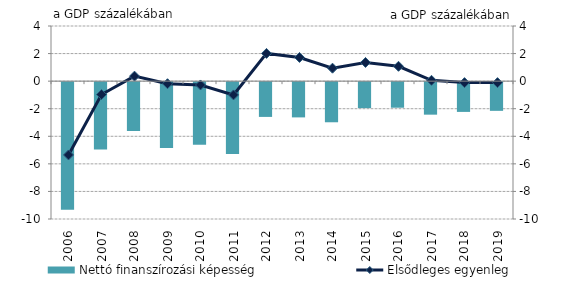
| Category | Nettó finanszírozási képesség |
|---|---|
| 2006.0 | -9.252 |
| 2007.0 | -4.887 |
| 2008.0 | -3.544 |
| 2009.0 | -4.778 |
| 2010.0 | -4.541 |
| 2011.0 | -5.211 |
| 2012.0 | -2.522 |
| 2013.0 | -2.557 |
| 2014.0 | -2.911 |
| 2015.0 | -1.886 |
| 2016.0 | -1.855 |
| 2017.0 | -2.359 |
| 2018.0 | -2.159 |
| 2019.0 | -2.082 |